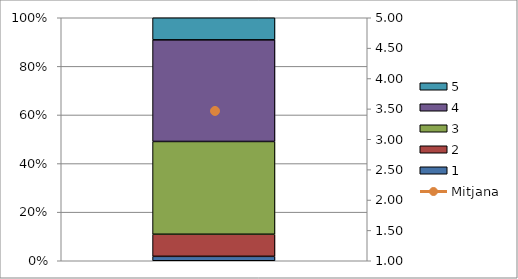
| Category | 1 | 2 | 3 | 4 | 5 |
|---|---|---|---|---|---|
| 0 | 1 | 5 | 21 | 23 | 5 |